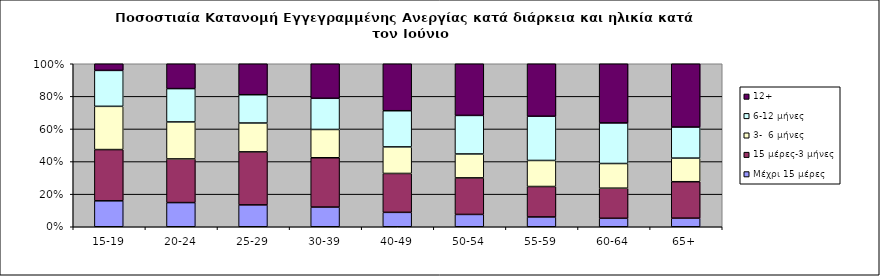
| Category | Μέχρι 15 μέρες | 15 μέρες-3 μήνες | 3-  6 μήνες | 6-12 μήνες | 12+ |
|---|---|---|---|---|---|
| 15-19 | 0.159 | 0.314 | 0.265 | 0.22 | 0.041 |
| 20-24 | 0.148 | 0.268 | 0.227 | 0.204 | 0.153 |
| 25-29 | 0.134 | 0.325 | 0.177 | 0.174 | 0.19 |
| 30-39 | 0.121 | 0.302 | 0.174 | 0.191 | 0.212 |
| 40-49 | 0.088 | 0.239 | 0.163 | 0.222 | 0.288 |
| 50-54 | 0.076 | 0.224 | 0.147 | 0.237 | 0.317 |
| 55-59 | 0.06 | 0.187 | 0.16 | 0.271 | 0.322 |
| 60-64 | 0.052 | 0.185 | 0.151 | 0.249 | 0.363 |
| 65+ | 0.053 | 0.224 | 0.145 | 0.191 | 0.388 |